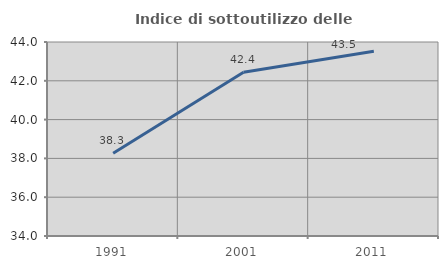
| Category | Indice di sottoutilizzo delle abitazioni  |
|---|---|
| 1991.0 | 38.262 |
| 2001.0 | 42.441 |
| 2011.0 | 43.522 |